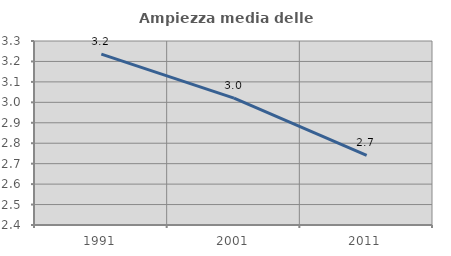
| Category | Ampiezza media delle famiglie |
|---|---|
| 1991.0 | 3.236 |
| 2001.0 | 3.021 |
| 2011.0 | 2.741 |